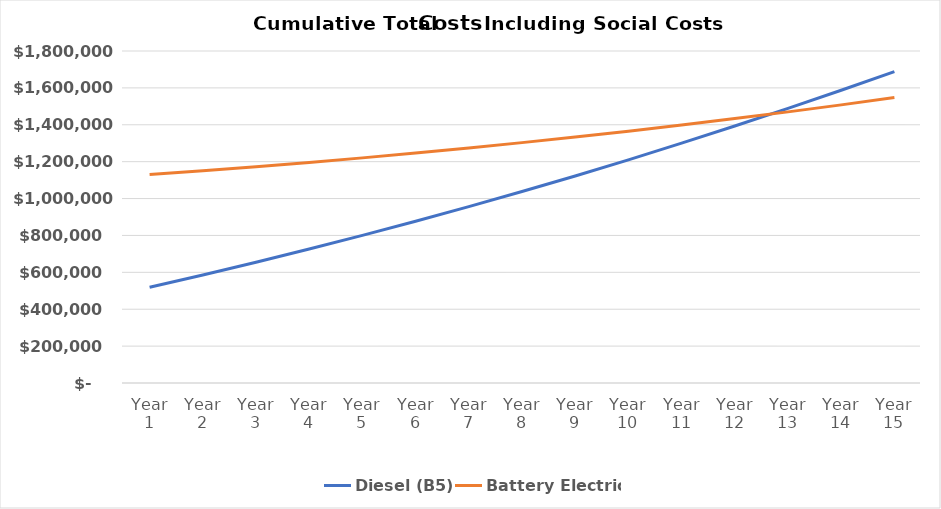
| Category | Diesel (B5) | Battery Electric |
|---|---|---|
| Year 1 | 519527.85 | 1130649.174 |
| Year 2 | 585161.508 | 1151131.489 |
| Year 3 | 654434.182 | 1172793.519 |
| Year 4 | 726196.702 | 1195778.386 |
| Year 5 | 800365.636 | 1220575.043 |
| Year 6 | 877011.29 | 1246743.879 |
| Year 7 | 956196.82 | 1274280.655 |
| Year 8 | 1038027.083 | 1303228.851 |
| Year 9 | 1122329.164 | 1333647.878 |
| Year 10 | 1210064.878 | 1365456.396 |
| Year 11 | 1300437.82 | 1398791.879 |
| Year 12 | 1393565.835 | 1433585.753 |
| Year 13 | 1489189.53 | 1469992.023 |
| Year 14 | 1587272.988 | 1507942.388 |
| Year 15 | 1687913.256 | 1547370.032 |